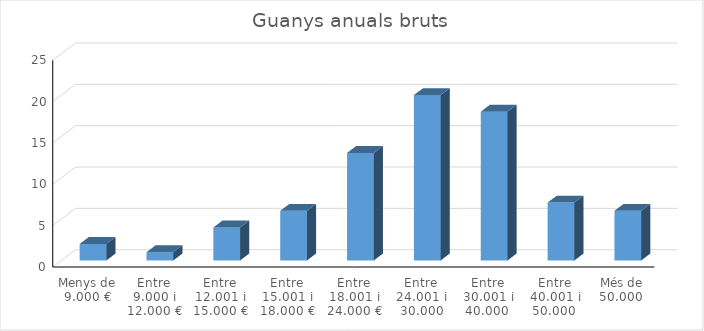
| Category | Series 0 |
|---|---|
| Menys de 9.000 € | 2 |
| Entre 9.000 i 12.000 € | 1 |
| Entre 12.001 i 15.000 € | 4 |
| Entre 15.001 i 18.000 € | 6 |
| Entre 18.001 i 24.000 € | 13 |
| Entre 24.001 i 30.000 | 20 |
| Entre 30.001 i 40.000  | 18 |
| Entre 40.001 i 50.000  | 7 |
| Més de 50.000  | 6 |